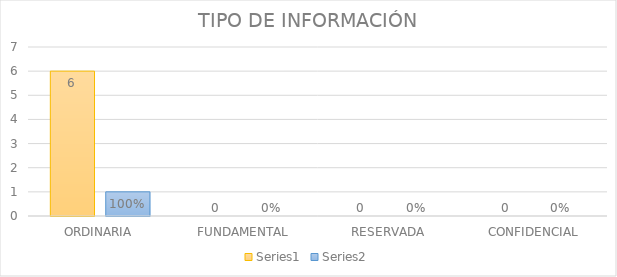
| Category | Series 3 | Series 4 |
|---|---|---|
| ORDINARIA | 6 | 1 |
| FUNDAMENTAL | 0 | 0 |
| RESERVADA | 0 | 0 |
| CONFIDENCIAL | 0 | 0 |